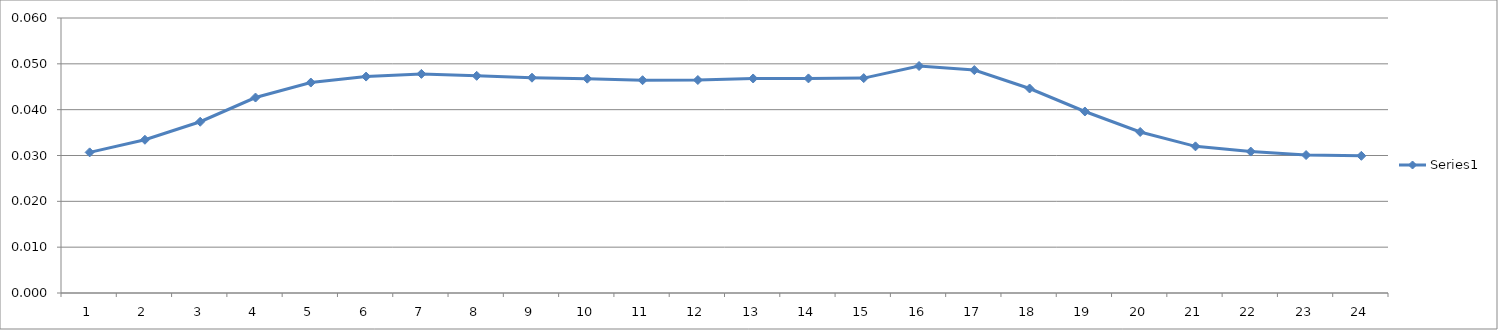
| Category | Series 0 |
|---|---|
| 0 | 0.031 |
| 1 | 0.033 |
| 2 | 0.037 |
| 3 | 0.043 |
| 4 | 0.046 |
| 5 | 0.047 |
| 6 | 0.048 |
| 7 | 0.047 |
| 8 | 0.047 |
| 9 | 0.047 |
| 10 | 0.046 |
| 11 | 0.046 |
| 12 | 0.047 |
| 13 | 0.047 |
| 14 | 0.047 |
| 15 | 0.05 |
| 16 | 0.049 |
| 17 | 0.045 |
| 18 | 0.04 |
| 19 | 0.035 |
| 20 | 0.032 |
| 21 | 0.031 |
| 22 | 0.03 |
| 23 | 0.03 |